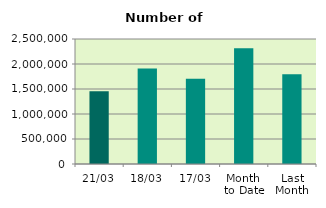
| Category | Series 0 |
|---|---|
| 21/03 | 1452732 |
| 18/03 | 1911320 |
| 17/03 | 1706456 |
| Month 
to Date | 2316177.333 |
| Last
Month | 1795830.8 |